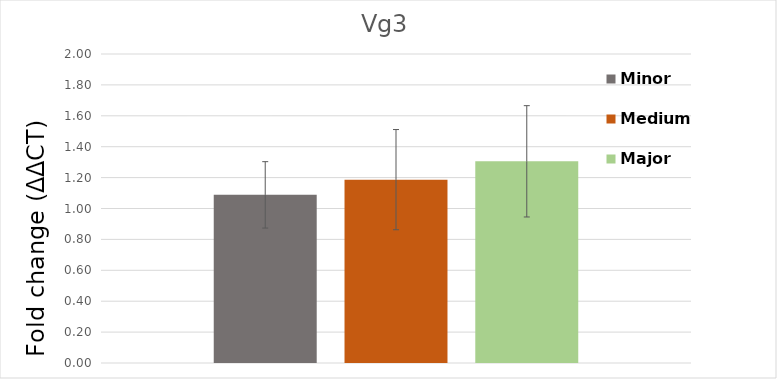
| Category | Minor | Medium | Major |
|---|---|---|---|
| Vg3 | 1.088 | 1.187 | 1.305 |